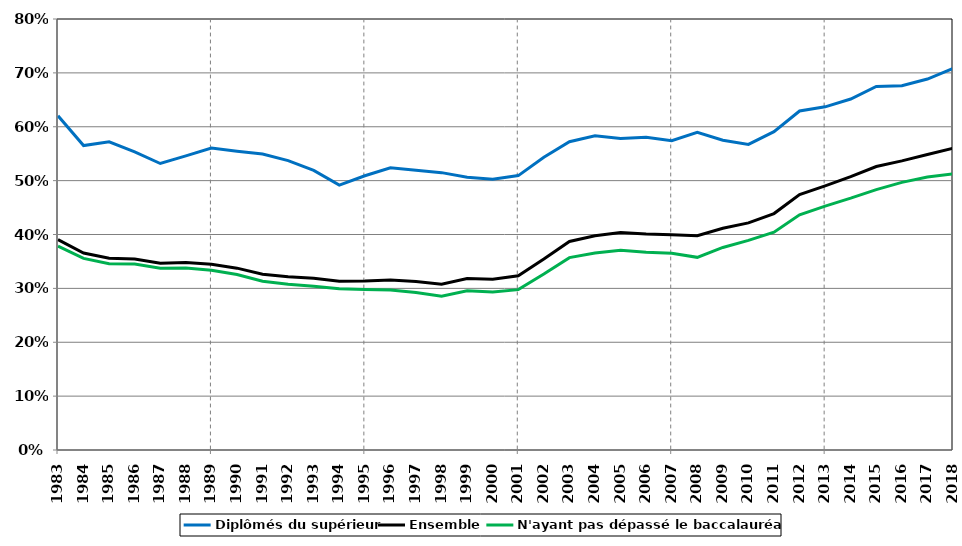
| Category | Diplômés du supérieur | Ensemble | N'ayant pas dépassé le baccalauréat* |
|---|---|---|---|
| 1983.0 | 0.62 | 0.39 | 0.378 |
| 1984.0 | 0.565 | 0.366 | 0.356 |
| 1985.0 | 0.572 | 0.356 | 0.346 |
| 1986.0 | 0.553 | 0.355 | 0.345 |
| 1987.0 | 0.532 | 0.347 | 0.338 |
| 1988.0 | 0.546 | 0.348 | 0.338 |
| 1989.0 | 0.561 | 0.345 | 0.334 |
| 1990.0 | 0.555 | 0.338 | 0.326 |
| 1991.0 | 0.549 | 0.326 | 0.313 |
| 1992.0 | 0.537 | 0.322 | 0.308 |
| 1993.0 | 0.519 | 0.319 | 0.304 |
| 1994.0 | 0.492 | 0.313 | 0.299 |
| 1995.0 | 0.509 | 0.314 | 0.298 |
| 1996.0 | 0.524 | 0.315 | 0.297 |
| 1997.0 | 0.519 | 0.313 | 0.292 |
| 1998.0 | 0.515 | 0.307 | 0.285 |
| 1999.0 | 0.506 | 0.318 | 0.296 |
| 2000.0 | 0.503 | 0.317 | 0.293 |
| 2001.0 | 0.509 | 0.323 | 0.298 |
| 2002.0 | 0.543 | 0.354 | 0.327 |
| 2003.0 | 0.572 | 0.387 | 0.357 |
| 2004.0 | 0.583 | 0.398 | 0.366 |
| 2005.0 | 0.578 | 0.404 | 0.371 |
| 2006.0 | 0.581 | 0.401 | 0.367 |
| 2007.0 | 0.574 | 0.4 | 0.365 |
| 2008.0 | 0.59 | 0.398 | 0.358 |
| 2009.0 | 0.575 | 0.412 | 0.376 |
| 2010.0 | 0.567 | 0.422 | 0.389 |
| 2011.0 | 0.591 | 0.439 | 0.404 |
| 2012.0 | 0.629 | 0.474 | 0.436 |
| 2013.0 | 0.637 | 0.49 | 0.453 |
| 2014.0 | 0.652 | 0.507 | 0.467 |
| 2015.0 | 0.675 | 0.526 | 0.483 |
| 2016.0 | 0.676 | 0.537 | 0.497 |
| 2017.0 | 0.689 | 0.549 | 0.507 |
| 2018.0 | 0.708 | 0.56 | 0.512 |